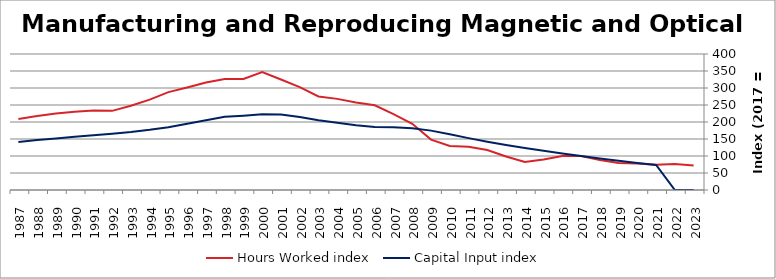
| Category | Hours Worked index | Capital Input index |
|---|---|---|
| 2023.0 | 71.767 | 0 |
| 2022.0 | 76.662 | 0 |
| 2021.0 | 74.59 | 73.837 |
| 2020.0 | 77.824 | 79.523 |
| 2019.0 | 79.732 | 85.977 |
| 2018.0 | 88.135 | 92.963 |
| 2017.0 | 100 | 100 |
| 2016.0 | 99.653 | 107.496 |
| 2015.0 | 89.64 | 115.104 |
| 2014.0 | 82.282 | 123.201 |
| 2013.0 | 98.755 | 132.07 |
| 2012.0 | 117.555 | 141.992 |
| 2011.0 | 127.483 | 152.542 |
| 2010.0 | 129.442 | 163.869 |
| 2009.0 | 148.189 | 174.625 |
| 2008.0 | 194.581 | 181.373 |
| 2007.0 | 222.993 | 184.203 |
| 2006.0 | 249.06 | 185.606 |
| 2005.0 | 257.223 | 190.125 |
| 2004.0 | 268.05 | 197.553 |
| 2003.0 | 275.112 | 205.294 |
| 2002.0 | 302.538 | 214.652 |
| 2001.0 | 324.859 | 222.102 |
| 2000.0 | 346.86 | 222.627 |
| 1999.0 | 326.717 | 218.506 |
| 1998.0 | 326.252 | 215.222 |
| 1997.0 | 315.977 | 205.242 |
| 1996.0 | 301.736 | 194.684 |
| 1995.0 | 287.813 | 184.633 |
| 1994.0 | 265.721 | 176.925 |
| 1993.0 | 247.94 | 170.517 |
| 1992.0 | 232.817 | 165.457 |
| 1991.0 | 233.593 | 161.186 |
| 1990.0 | 229.843 | 156.407 |
| 1989.0 | 224.912 | 151.354 |
| 1988.0 | 217.578 | 146.781 |
| 1987.0 | 208.735 | 141.472 |